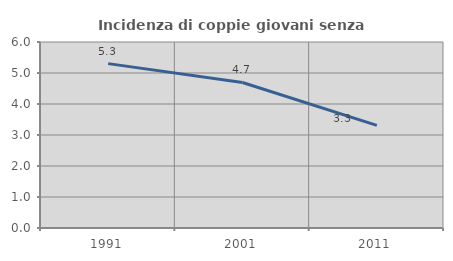
| Category | Incidenza di coppie giovani senza figli |
|---|---|
| 1991.0 | 5.302 |
| 2001.0 | 4.695 |
| 2011.0 | 3.312 |